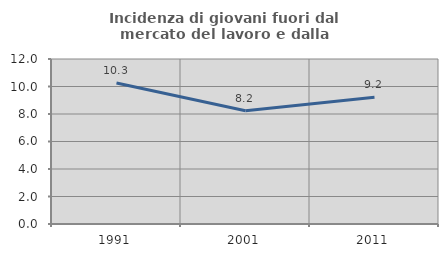
| Category | Incidenza di giovani fuori dal mercato del lavoro e dalla formazione  |
|---|---|
| 1991.0 | 10.256 |
| 2001.0 | 8.235 |
| 2011.0 | 9.217 |